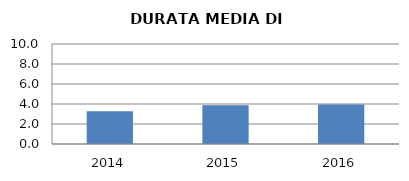
| Category | 2014 2015 2016 |
|---|---|
| 2014.0 | 3.281 |
| 2015.0 | 3.866 |
| 2016.0 | 3.943 |